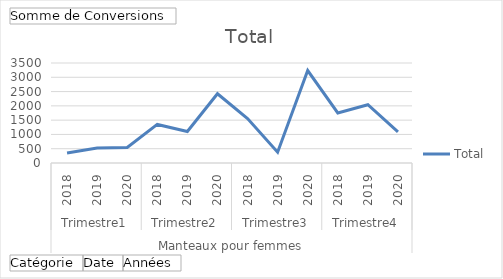
| Category | Total |
|---|---|
| 0 | 352 |
| 1 | 521 |
| 2 | 542 |
| 3 | 1350 |
| 4 | 1103 |
| 5 | 2424 |
| 6 | 1556 |
| 7 | 379 |
| 8 | 3237 |
| 9 | 1753 |
| 10 | 2039 |
| 11 | 1087 |